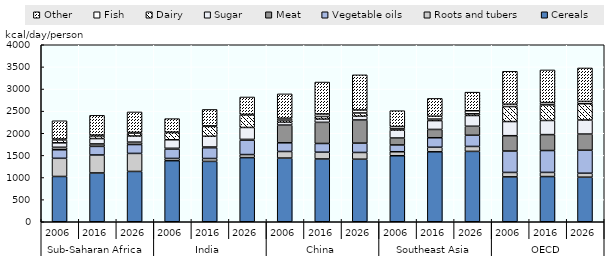
| Category | Cereals | Roots and tubers | Vegetable oils | Meat | Sugar | Dairy | Fish | Other |
|---|---|---|---|---|---|---|---|---|
| 0 | 1023.422 | 410.243 | 193.201 | 56.241 | 100.648 | 66.806 | 17.527 | 414.197 |
| 1 | 1102.753 | 406.283 | 194.302 | 55.381 | 121.232 | 60.605 | 17.469 | 447.303 |
| 2 | 1137.008 | 407.235 | 200.686 | 54.55 | 138.623 | 63.823 | 16.252 | 463.166 |
| 3 | 1380 | 51 | 212 | 17 | 193 | 163 | 9 | 305.369 |
| 4 | 1364.077 | 65.605 | 243.069 | 16.204 | 243.037 | 223.695 | 9.976 | 372.729 |
| 5 | 1449.378 | 69.193 | 324.92 | 17.997 | 269.233 | 285.768 | 10.468 | 392.666 |
| 6 | 1439 | 149 | 196 | 401 | 63 | 50 | 40 | 552 |
| 7 | 1419.041 | 152.779 | 196.945 | 477.739 | 72.477 | 59.803 | 56.84 | 721.855 |
| 8 | 1413.149 | 152.78 | 210.879 | 523.517 | 84.849 | 73.109 | 67.74 | 793.999 |
| 9 | 1491.615 | 90.462 | 153.579 | 157.279 | 179.831 | 25.805 | 53.591 | 357.806 |
| 10 | 1580.833 | 102.879 | 214.924 | 187.618 | 199.442 | 34.31 | 65.321 | 401.843 |
| 11 | 1590.27 | 111.558 | 253.009 | 203.398 | 242.698 | 38.534 | 68.565 | 420.93 |
| 12 | 1014.216 | 100.502 | 483.253 | 346.635 | 319.931 | 338.633 | 54.064 | 742.834 |
| 13 | 1021.102 | 94.217 | 494.47 | 359.538 | 319.246 | 352.662 | 51.919 | 738.04 |
| 14 | 1006.965 | 89.597 | 519.481 | 365.668 | 317.697 | 367.977 | 52.57 | 756.027 |